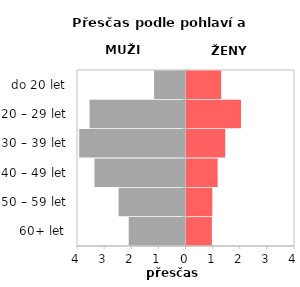
| Category | Přesčas |
|---|---|
| 60+ let | 0.936 |
| 50 – 59 let | 0.953 |
| 40 – 49 let | 1.148 |
| 30 – 39 let | 1.429 |
| 20 – 29 let | 2.01 |
| do 20 let | 1.278 |